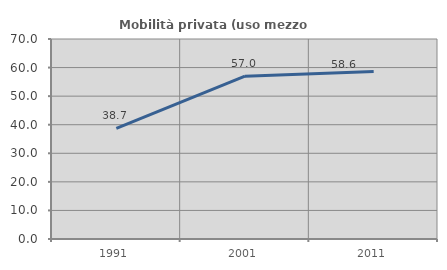
| Category | Mobilità privata (uso mezzo privato) |
|---|---|
| 1991.0 | 38.693 |
| 2001.0 | 56.97 |
| 2011.0 | 58.59 |